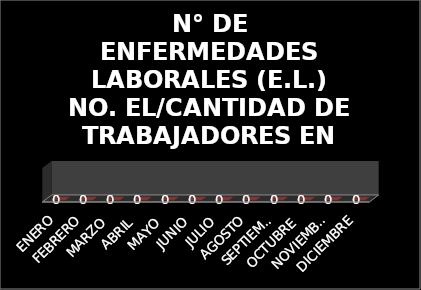
| Category | N° DE ENFERMEDADES LABORALES (E.L.)
NO. EL/CANTIDAD DE TRABAJADORES EN EL PERIODO |
|---|---|
| ENERO | 0 |
| FEBRERO | 0 |
| MARZO | 0 |
| ABRIL | 0 |
| MAYO | 0 |
| JUNIO | 0 |
| JULIO | 0 |
| AGOSTO | 0 |
| SEPTIEMBRE | 0 |
| OCTUBRE | 0 |
| NOVIEMBRE | 0 |
| DICIEMBRE | 0 |